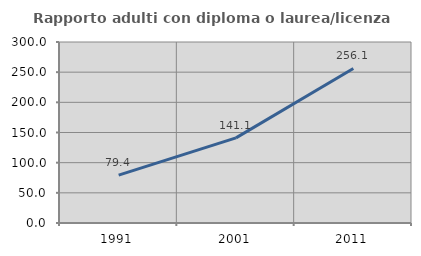
| Category | Rapporto adulti con diploma o laurea/licenza media  |
|---|---|
| 1991.0 | 79.368 |
| 2001.0 | 141.127 |
| 2011.0 | 256.127 |